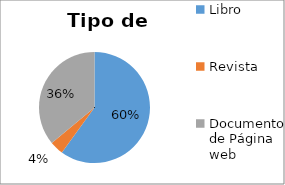
| Category | Tipo de documento |
|---|---|
| Libro | 15 |
| Revista | 1 |
| Documento de Página web | 9 |